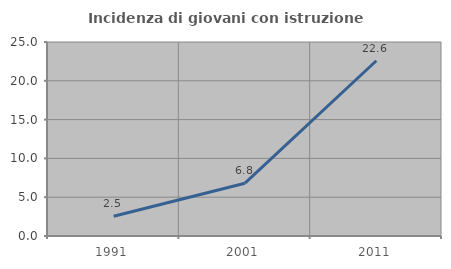
| Category | Incidenza di giovani con istruzione universitaria |
|---|---|
| 1991.0 | 2.542 |
| 2001.0 | 6.803 |
| 2011.0 | 22.581 |